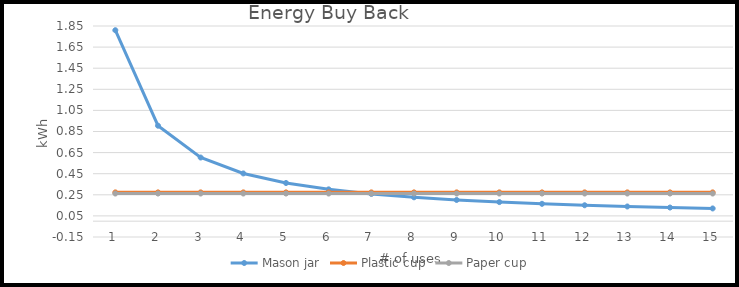
| Category | Mason jar | Plastic cup | Paper cup |
|---|---|---|---|
| 0 | 1.81 | 0.273 | 0.262 |
| 1 | 0.905 | 0.273 | 0.262 |
| 2 | 0.603 | 0.273 | 0.262 |
| 3 | 0.452 | 0.273 | 0.262 |
| 4 | 0.362 | 0.273 | 0.262 |
| 5 | 0.302 | 0.273 | 0.262 |
| 6 | 0.259 | 0.273 | 0.262 |
| 7 | 0.226 | 0.273 | 0.262 |
| 8 | 0.201 | 0.273 | 0.262 |
| 9 | 0.181 | 0.273 | 0.262 |
| 10 | 0.165 | 0.273 | 0.262 |
| 11 | 0.151 | 0.273 | 0.262 |
| 12 | 0.139 | 0.273 | 0.262 |
| 13 | 0.129 | 0.273 | 0.262 |
| 14 | 0.121 | 0.273 | 0.262 |